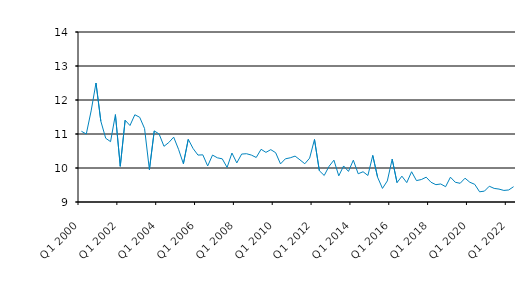
| Category | Series 0 |
|---|---|
| Q1 2000 | 11.08 |
| Q2 2000 | 11 |
| Q3 2000 | 11.679 |
| Q4 2000 | 12.5 |
| Q1 2001 | 11.375 |
| Q2 2001 | 10.875 |
| Q3 2001 | 10.775 |
| Q4 2001 | 11.57 |
| Q1 2002 | 10.05 |
| Q2 2002 | 11.405 |
| Q3 2002 | 11.25 |
| Q4 2002 | 11.566 |
| Q1 2003 | 11.492 |
| Q2 2003 | 11.162 |
| Q3 2003 | 9.95 |
| Q4 2003 | 11.091 |
| Q1 2004 | 11 |
| Q2 2004 | 10.638 |
| Q3 2004 | 10.75 |
| Q4 2004 | 10.908 |
| Q1 2005 | 10.55 |
| Q2 2005 | 10.125 |
| Q3 2005 | 10.843 |
| Q4 2005 | 10.573 |
| Q1 2006 | 10.38 |
| Q2 2006 | 10.387 |
| Q3 2006 | 10.06 |
| Q4 2006 | 10.38 |
| Q1 2007 | 10.3 |
| Q2 2007 | 10.27 |
| Q3 2007 | 10.017 |
| Q4 2007 | 10.44 |
| Q1 2008 | 10.15 |
| Q2 2008 | 10.41 |
| Q3 2008 | 10.42 |
| Q4 2008 | 10.38 |
| Q1 2009 | 10.31 |
| Q2 2009 | 10.55 |
| Q3 2009 | 10.46 |
| Q4 2009 | 10.54 |
| Q1 2010 | 10.45 |
| Q2 2010 | 10.12 |
| Q3 2010 | 10.27 |
| Q4 2010 | 10.3 |
| Q1 2011 | 10.35 |
| Q2 2011 | 10.24 |
| Q3 2011 | 10.125 |
| Q4 2011 | 10.29 |
| Q1 2012 | 10.84 |
| Q2 2012 | 9.92 |
| Q3 2012 | 9.78 |
| Q4 2012 | 10.05 |
| Q1 2013 | 10.23 |
| Q2 2013 | 9.77 |
| Q3 2013 | 10.06 |
| Q4 2013 | 9.9 |
| Q1 2014 | 10.23 |
| Q2 2014 | 9.83 |
| Q3 2014 | 9.89 |
| Q4 2014 | 9.78 |
| Q1 2015 | 10.37 |
| Q2 2015 | 9.726 |
| Q3 2015 | 9.4 |
| Q4 2015 | 9.62 |
| Q1 2016 | 10.26 |
| Q2 2016 | 9.57 |
| Q3 2016 | 9.76 |
| Q4 2016 | 9.57 |
| Q1 2017 | 9.89 |
| Q2 2017 | 9.63 |
| Q3 2017 | 9.66 |
| Q4 2017 | 9.73 |
| Q1 2018 | 9.58 |
| Q2 2018 | 9.51 |
| Q3 2018 | 9.53 |
| Q4 2018 | 9.45 |
| Q1 2019 | 9.73 |
| Q2 2019 | 9.58 |
| Q3 2019 | 9.55 |
| Q4 2019 | 9.7 |
| Q1 2020 | 9.58 |
| Q2 2020 | 9.52 |
| Q3 2020 | 9.3 |
| Q4 2020 | 9.32 |
| Q1 2021 | 9.464 |
| Q2 2021 | 9.4 |
| Q3 2021 | 9.38 |
| Q4 2021 | 9.34 |
| Q1 2022 | 9.354 |
| Q2 2022 | 9.45 |